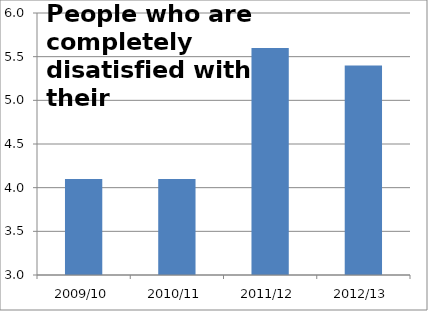
| Category | Series 0 |
|---|---|
| 2009/10 | 4.1 |
| 2010/11 | 4.1 |
| 2011/12 | 5.6 |
| 2012/13 | 5.4 |